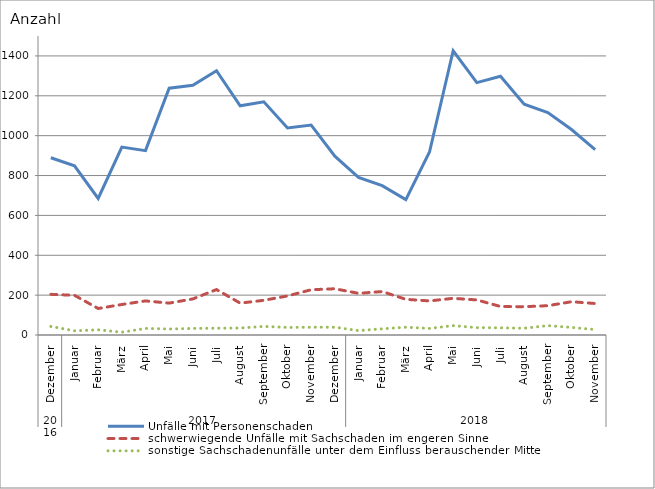
| Category | Unfälle mit Personenschaden | schwerwiegende Unfälle mit Sachschaden im engeren Sinne | sonstige Sachschadenunfälle unter dem Einfluss berauschender Mittel |
|---|---|---|---|
| 0 | 889 | 204 | 43 |
| 1 | 849 | 199 | 21 |
| 2 | 685 | 133 | 26 |
| 3 | 943 | 153 | 14 |
| 4 | 925 | 171 | 33 |
| 5 | 1238 | 160 | 30 |
| 6 | 1253 | 181 | 33 |
| 7 | 1326 | 228 | 34 |
| 8 | 1150 | 160 | 35 |
| 9 | 1170 | 174 | 43 |
| 10 | 1039 | 196 | 38 |
| 11 | 1053 | 227 | 39 |
| 12 | 897 | 232 | 39 |
| 13 | 791 | 209 | 22 |
| 14 | 749 | 218 | 31 |
| 15 | 679 | 179 | 39 |
| 16 | 918 | 171 | 33 |
| 17 | 1426 | 184 | 47 |
| 18 | 1266 | 176 | 37 |
| 19 | 1298 | 143 | 36 |
| 20 | 1158 | 142 | 34 |
| 21 | 1116 | 147 | 47 |
| 22 | 1031 | 167 | 38 |
| 23 | 930 | 158 | 27 |